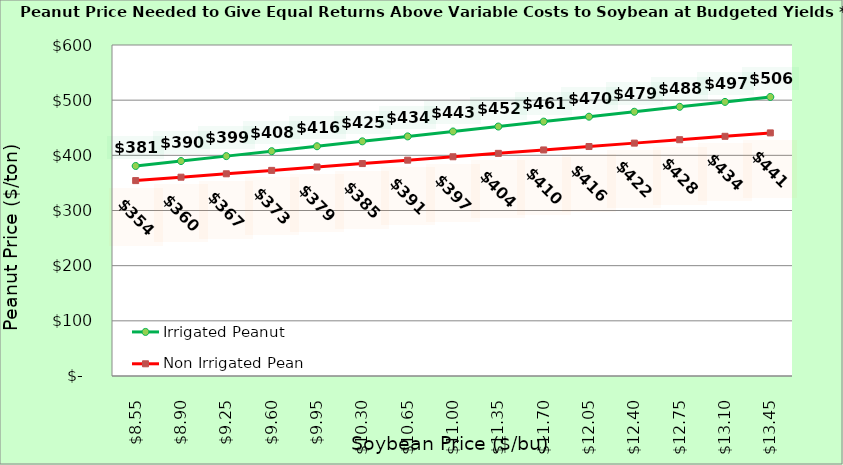
| Category | Irrigated Peanut | Non Irrigated Peanut |
|---|---|---|
| 8.550000000000002 | 380.703 | 354.191 |
| 8.900000000000002 | 389.639 | 360.368 |
| 9.250000000000002 | 398.575 | 366.544 |
| 9.600000000000001 | 407.511 | 372.721 |
| 9.950000000000001 | 416.447 | 378.897 |
| 10.3 | 425.383 | 385.074 |
| 10.65 | 434.32 | 391.25 |
| 11.0 | 443.256 | 397.426 |
| 11.35 | 452.192 | 403.603 |
| 11.7 | 461.128 | 409.779 |
| 12.049999999999999 | 470.064 | 415.956 |
| 12.399999999999999 | 479 | 422.132 |
| 12.749999999999998 | 487.937 | 428.309 |
| 13.099999999999998 | 496.873 | 434.485 |
| 13.449999999999998 | 505.809 | 440.662 |